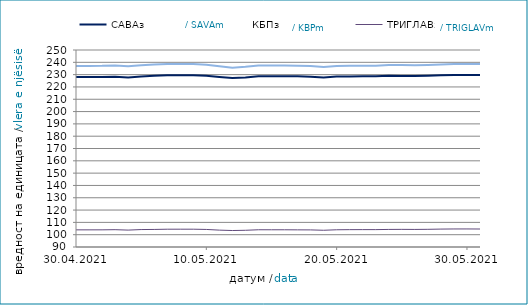
| Category | САВАз | КБПз | ТРИГЛАВз |
|---|---|---|---|
| 2021-04-30 | 228.138 | 237.083 | 103.929 |
| 2021-05-01 | 228.15 | 237.096 | 103.933 |
| 2021-05-02 | 228.162 | 237.11 | 103.937 |
| 2021-05-03 | 228.351 | 237.442 | 104.063 |
| 2021-05-04 | 227.727 | 236.802 | 103.723 |
| 2021-05-05 | 228.512 | 237.697 | 104.171 |
| 2021-05-06 | 229.052 | 238.27 | 104.254 |
| 2021-05-07 | 229.421 | 238.603 | 104.452 |
| 2021-05-08 | 229.438 | 238.625 | 104.458 |
| 2021-05-09 | 229.451 | 238.638 | 104.462 |
| 2021-05-10 | 229.028 | 238.065 | 104.259 |
| 2021-05-11 | 227.985 | 236.812 | 103.695 |
| 2021-05-12 | 227.163 | 235.558 | 103.379 |
| 2021-05-13 | 227.652 | 236.3 | 103.575 |
| 2021-05-14 | 228.727 | 237.41 | 103.999 |
| 2021-05-15 | 228.679 | 237.351 | 103.985 |
| 2021-05-16 | 228.692 | 237.364 | 103.99 |
| 2021-05-17 | 228.602 | 237.223 | 103.929 |
| 2021-05-18 | 228.347 | 236.929 | 103.895 |
| 2021-05-19 | 227.629 | 236.188 | 103.583 |
| 2021-05-20 | 228.441 | 237.071 | 103.996 |
| 2021-05-21 | 228.528 | 237.123 | 104.09 |
| 2021-05-22 | 228.605 | 237.214 | 104.118 |
| 2021-05-23 | 228.618 | 237.227 | 104.122 |
| 2021-05-24 | 229.029 | 237.816 | 104.267 |
| 2021-05-25 | 228.904 | 237.831 | 104.322 |
| 2021-05-26 | 228.864 | 237.569 | 104.274 |
| 2021-05-27 | 229.071 | 237.9 | 104.358 |
| 2021-05-28 | 229.465 | 238.289 | 104.546 |
| 2021-05-29 | 229.782 | 238.693 | 104.657 |
| 2021-05-30 | 229.795 | 238.707 | 104.66 |
| 2021-05-31 | 229.674 | 238.725 | 104.615 |